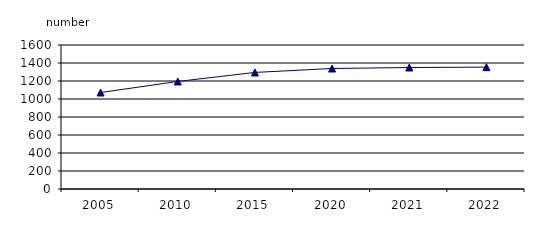
| Category | Muzeylərdə əsas fond eksponatlarının sayı |
|---|---|
| 2005.0 | 1072 |
| 2010.0 | 1195 |
| 2015.0 | 1295 |
| 2020.0 | 1339 |
| 2021.0 | 1350 |
| 2022.0 | 1354 |